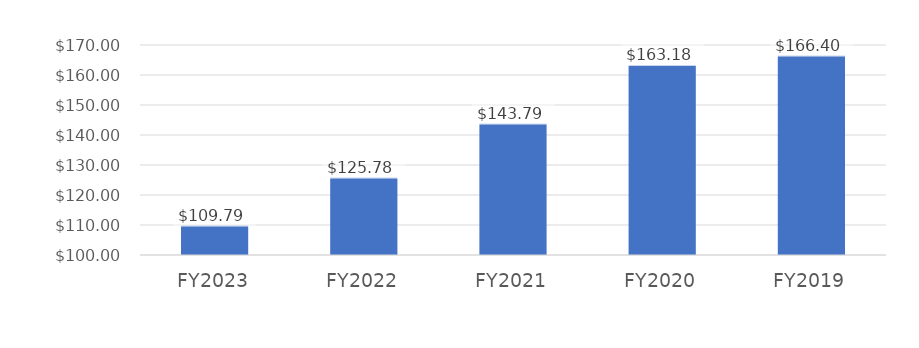
| Category | Adjusted Tax-Supported Debt Per Capita |
|---|---|
| FY2023 | 109.79 |
| FY2022 | 125.784 |
| FY2021 | 143.786 |
| FY2020 | 163.183 |
| FY2019 | 166.405 |